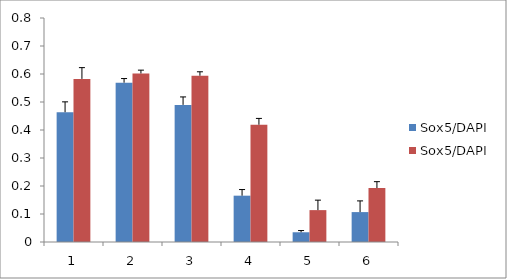
| Category | Sox5/DAPI |
|---|---|
| 0 | 0.582 |
| 1 | 0.602 |
| 2 | 0.594 |
| 3 | 0.419 |
| 4 | 0.114 |
| 5 | 0.193 |